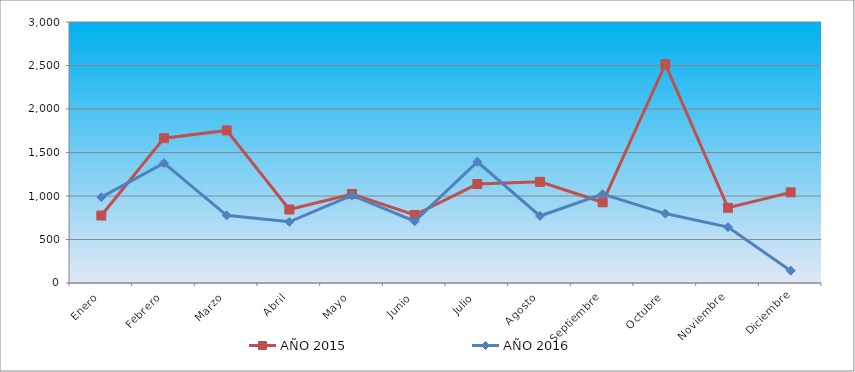
| Category | AÑO 2015 | AÑO 2016 |
|---|---|---|
| Enero | 775.2 | 986.519 |
| Febrero | 1664.774 | 1377.284 |
| Marzo | 1753.732 | 777.555 |
| Abril | 845.095 | 703.18 |
| Mayo | 1023.01 | 1007.44 |
| Junio | 781.554 | 709.941 |
| Julio | 1137.384 | 1392.837 |
| Agosto | 1162.801 | 770.793 |
| Septiembre | 927.699 | 1020.963 |
| Octubre | 2516.224 | 797.839 |
| Noviembre | 864.158 | 642.328 |
| Diciembre | 1042.073 | 141.988 |